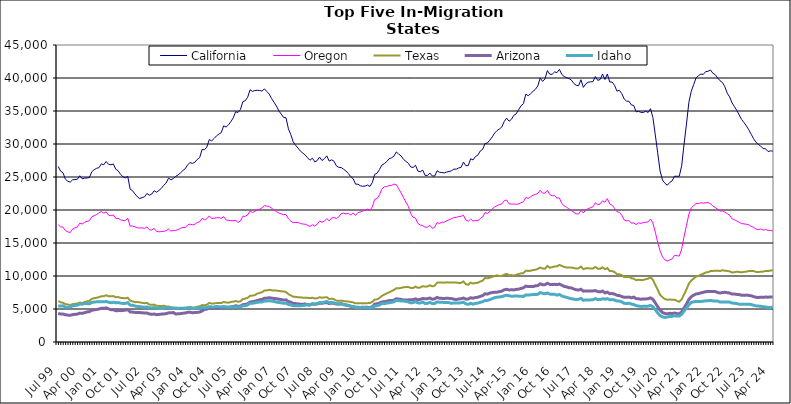
| Category |  California  |  Oregon  |  Texas  |  Arizona  |  Idaho  |
|---|---|---|---|---|---|
| Jul 99 | 26605 | 17749 | 6209 | 4339 | 5471 |
| Aug 99 | 25882 | 17447 | 6022 | 4228 | 5444 |
| Sep 99 | 25644 | 17401 | 5941 | 4237 | 5488 |
| Oct 99 | 24669 | 16875 | 5751 | 4134 | 5279 |
| Nov 99 | 24353 | 16701 | 5680 | 4073 | 5260 |
| Dec 99 | 24218 | 16570 | 5619 | 4042 | 5269 |
| Jan 00 | 24574 | 17109 | 5736 | 4142 | 5485 |
| Feb 00 | 24620 | 17295 | 5789 | 4192 | 5530 |
| Mar 00 | 24655 | 17436 | 5826 | 4226 | 5590 |
| Apr 00 | 25195 | 18009 | 5980 | 4375 | 5748 |
| May 00 | 24730 | 17875 | 5897 | 4337 | 5729 |
| Jun 00 | 24825 | 18113 | 6070 | 4444 | 5853 |
| Jul 00 | 24857 | 18294 | 6163 | 4555 | 5824 |
| Aug 00 | 24913 | 18376 | 6199 | 4603 | 5788 |
| Sep 00 | 25792 | 18971 | 6529 | 4804 | 5976 |
| Oct 00 | 26106 | 19135 | 6643 | 4870 | 6058 |
| Nov 00 | 26315 | 19306 | 6705 | 4926 | 6085 |
| Dec 00 | 26415 | 19570 | 6793 | 4991 | 6096 |
| Jan 01 | 26995 | 19781 | 6942 | 5122 | 6119 |
| Feb 01 | 26851 | 19519 | 6948 | 5089 | 6090 |
| Mar 01 | 27352 | 19720 | 7080 | 5180 | 6143 |
| Apr 01 | 26918 | 19221 | 6943 | 5020 | 6020 |
| May 01 | 26848 | 19126 | 6924 | 4899 | 5950 |
| Jun 01 | 26974 | 19241 | 6959 | 4895 | 6019 |
| Jul 01 | 26172 | 18725 | 6778 | 4737 | 5951 |
| Aug 01 | 25943 | 18736 | 6810 | 4757 | 5973 |
| Sep 01 | 25399 | 18514 | 6688 | 4753 | 5895 |
| Oct 01 | 25050 | 18415 | 6650 | 4780 | 5833 |
| Nov 01 | 24873 | 18381 | 6631 | 4826 | 5850 |
| Dec 01 | 25099 | 18765 | 6708 | 4898 | 5969 |
| Jan 02 | 23158 | 17561 | 6261 | 4560 | 5595 |
| Feb 02 | 22926 | 17573 | 6162 | 4531 | 5560 |
| Mar 02 | 22433 | 17452 | 6052 | 4481 | 5458 |
| Apr 02 | 22012 | 17314 | 6046 | 4458 | 5380 |
| May 02 | 21733 | 17267 | 6007 | 4452 | 5358 |
| Jun 02 | 21876 | 17298 | 5933 | 4444 | 5315 |
| Jul 02 | 21997 | 17209 | 5873 | 4383 | 5243 |
| Aug 02 | 22507 | 17436 | 5929 | 4407 | 5315 |
| Sep 02 | 22244 | 17010 | 5672 | 4248 | 5192 |
| Oct 02 | 22406 | 16952 | 5625 | 4191 | 5167 |
| Nov 02 | 22922 | 17223 | 5663 | 4242 | 5221 |
| Dec 02 | 22693 | 16770 | 5499 | 4142 | 5120 |
| Jan 03 | 22964 | 16694 | 5463 | 4166 | 5089 |
| Feb 03 | 23276 | 16727 | 5461 | 4226 | 5077 |
| Mar 03 | 23736 | 16766 | 5486 | 4251 | 5145 |
| Apr 03 | 24079 | 16859 | 5389 | 4289 | 5145 |
| May 03 | 24821 | 17117 | 5378 | 4415 | 5254 |
| Jun 03 | 24592 | 16812 | 5273 | 4426 | 5135 |
| Jul 03 | 24754 | 16875 | 5226 | 4466 | 5124 |
| Aug 03 | 25092 | 16922 | 5181 | 4244 | 5100 |
| Sep 03 | 25316 | 17036 | 5181 | 4279 | 5086 |
| Oct 03 | 25622 | 17228 | 5139 | 4301 | 5110 |
| Nov 03 | 25984 | 17335 | 5175 | 4362 | 5091 |
| Dec 03 | 26269 | 17350 | 5189 | 4396 | 5113 |
| Jan 04 | 26852 | 17734 | 5255 | 4492 | 5152 |
| Feb 04 | 27184 | 17860 | 5301 | 4502 | 5183 |
| Mar 04 | 27062 | 17757 | 5227 | 4443 | 5056 |
| Apr 04 | 27238 | 17840 | 5227 | 4461 | 5104 |
| May 04 | 27671 | 18113 | 5345 | 4493 | 5095 |
| Jun 04 | 27949 | 18201 | 5416 | 4532 | 5103 |
| Jul 04 | 29172 | 18727 | 5597 | 4697 | 5231 |
| Aug 04 | 29122 | 18529 | 5561 | 4945 | 5197 |
| Sep 04 | 29542 | 18678 | 5656 | 4976 | 5237 |
| Oct 04 | 30674 | 19108 | 5922 | 5188 | 5363 |
| Nov 04 | 30472 | 18716 | 5823 | 5106 | 5321 |
| Dec 04 | 30831 | 18755 | 5838 | 5135 | 5312 |
| Jan 05 | 31224 | 18823 | 5906 | 5155 | 5374 |
| Feb 05 | 31495 | 18842 | 5898 | 5168 | 5357 |
| Mar 05 | 31714 | 18738 | 5894 | 5212 | 5313 |
| Apr 05 | 32750 | 18998 | 6060 | 5340 | 5350 |
| May 05 | 32575 | 18504 | 5989 | 5269 | 5276 |
| Jun 05 | 32898 | 18414 | 5954 | 5252 | 5271 |
| Jul 05 | 33384 | 18395 | 6062 | 5322 | 5322 |
| Aug 05 | 33964 | 18381 | 6113 | 5375 | 5316 |
| Sep 05 | 34897 | 18426 | 6206 | 5493 | 5362 |
| Oct 05 | 34780 | 18132 | 6100 | 5408 | 5308 |
| Nov 05 | 35223 | 18332 | 6162 | 5434 | 5314 |
| Dec 05 | 36415 | 19047 | 6508 | 5658 | 5487 |
| Jan 06 | 36567 | 19032 | 6576 | 5688 | 5480 |
| Feb 06 | 37074 | 19257 | 6692 | 5792 | 5616 |
| Mar 06 | 38207 | 19845 | 6993 | 6052 | 5850 |
| Apr 06 | 37976 | 19637 | 7024 | 6101 | 5864 |
| May 06 | 38099 | 19781 | 7114 | 6178 | 5943 |
| Jun 06 | 38141 | 20061 | 7331 | 6276 | 6018 |
| Jul 06 | 38097 | 20111 | 7431 | 6399 | 6046 |
| Aug 06 | 38021 | 20333 | 7542 | 6450 | 6064 |
| Sep 06 | 38349 | 20686 | 7798 | 6627 | 6232 |
| Oct 06 | 37947 | 20591 | 7825 | 6647 | 6216 |
| Nov 06 | 37565 | 20526 | 7907 | 6707 | 6244 |
| Dec 06 | 36884 | 20272 | 7840 | 6648 | 6192 |
| Jan 07 | 36321 | 19984 | 7789 | 6597 | 6151 |
| Feb 07 | 35752 | 19752 | 7799 | 6554 | 6048 |
| Mar 07 | 35025 | 19547 | 7737 | 6487 | 5989 |
| Apr 07 | 34534 | 19412 | 7685 | 6430 | 5937 |
| May 07 | 34022 | 19296 | 7654 | 6353 | 5858 |
| Jun 07 | 33974 | 19318 | 7577 | 6390 | 5886 |
| Jul 07 | 32298 | 18677 | 7250 | 6117 | 5682 |
| Aug 07 | 31436 | 18322 | 7070 | 6034 | 5617 |
| Sep 07 | 30331 | 18087 | 6853 | 5847 | 5500 |
| Oct 07 | 29813 | 18108 | 6839 | 5821 | 5489 |
| Nov 07 | 29384 | 18105 | 6777 | 5769 | 5481 |
| Dec 07 | 28923 | 17949 | 6760 | 5733 | 5499 |
| Jan 08 | 28627 | 17890 | 6721 | 5732 | 5521 |
| Feb 08 | 28328 | 17834 | 6719 | 5749 | 5579 |
| Mar 08 | 27911 | 17680 | 6690 | 5650 | 5614 |
| Apr 08 | 27543 | 17512 | 6656 | 5612 | 5635 |
| May 08 | 27856 | 17754 | 6705 | 5774 | 5798 |
| Jun 08 | 27287 | 17589 | 6593 | 5717 | 5745 |
| Jul 08 | 27495 | 17834 | 6623 | 5761 | 5807 |
| Aug 08 | 28018 | 18309 | 6789 | 5867 | 5982 |
| Sep-08 | 27491 | 18164 | 6708 | 5864 | 5954 |
| Oct 08 | 27771 | 18291 | 6755 | 5942 | 6032 |
| Nov 08 | 28206 | 18706 | 6787 | 5970 | 6150 |
| Dec 08 | 27408 | 18353 | 6505 | 5832 | 5975 |
| Jan 09 | 27601 | 18778 | 6569 | 5890 | 5995 |
| Feb 09 | 27394 | 18863 | 6483 | 5845 | 5936 |
| Mar 09 | 26690 | 18694 | 6273 | 5751 | 5806 |
| Apr 09 | 26461 | 18943 | 6222 | 5735 | 5777 |
| May 09 | 26435 | 19470 | 6272 | 5819 | 5767 |
| Jun 09 | 26187 | 19522 | 6199 | 5700 | 5649 |
| Jul 09 | 25906 | 19408 | 6171 | 5603 | 5617 |
| Aug 09 | 25525 | 19469 | 6128 | 5533 | 5540 |
| Sep 09 | 25050 | 19249 | 6059 | 5405 | 5437 |
| Oct 09 | 24741 | 19529 | 6004 | 5349 | 5369 |
| Nov 09 | 23928 | 19187 | 5854 | 5271 | 5248 |
| Dec 09 | 23899 | 19607 | 5886 | 5261 | 5195 |
| Jan 10 | 23676 | 19703 | 5881 | 5232 | 5234 |
| Feb 10 | 23592 | 19845 | 5850 | 5272 | 5236 |
| Mar 10 | 23634 | 19946 | 5864 | 5278 | 5219 |
| Apr 10 | 23774 | 20134 | 5889 | 5257 | 5201 |
| May 10 | 23567 | 19966 | 5897 | 5172 | 5105 |
| Jun 10 | 24166 | 20464 | 6087 | 5356 | 5237 |
| Jul 10 | 25410 | 21627 | 6417 | 5742 | 5452 |
| Aug 10 | 25586 | 21744 | 6465 | 5797 | 5491 |
| Sep 10 | 26150 | 22314 | 6667 | 5907 | 5609 |
| Oct 10 | 26807 | 23219 | 6986 | 6070 | 5831 |
| Nov 10 | 27033 | 23520 | 7179 | 6100 | 5810 |
| Dec 10 | 27332 | 23551 | 7361 | 6182 | 5898 |
| Jan 11 | 27769 | 23697 | 7525 | 6276 | 5938 |
| Feb 11 | 27898 | 23718 | 7708 | 6267 | 6016 |
| Mar 11 | 28155 | 23921 | 7890 | 6330 | 6081 |
| Apr 11 | 28790 | 23847 | 8146 | 6544 | 6305 |
| May 11 | 28471 | 23215 | 8131 | 6502 | 6248 |
| Jun 11 | 28191 | 22580 | 8199 | 6445 | 6217 |
| Jul 11 | 27678 | 21867 | 8291 | 6368 | 6202 |
| Aug 11 | 27372 | 21203 | 8321 | 6356 | 6146 |
| Sep 11 | 27082 | 20570 | 8341 | 6387 | 6075 |
| Oct 11 | 26528 | 19442 | 8191 | 6402 | 5932 |
| Nov 11 | 26440 | 18872 | 8176 | 6426 | 5968 |
| Dec 11 | 26770 | 18784 | 8401 | 6533 | 6106 |
| Jan 12 | 25901 | 17963 | 8202 | 6390 | 5933 |
| Feb 12 | 25796 | 17718 | 8266 | 6456 | 5900 |
| Mar 12 | 26042 | 17647 | 8456 | 6600 | 6054 |
| Apr 12 | 25239 | 17386 | 8388 | 6534 | 5838 |
| May 12 | 25238 | 17407 | 8401 | 6558 | 5854 |
| Jun 12 | 25593 | 17673 | 8594 | 6669 | 6009 |
| Jul 12 | 25155 | 17237 | 8432 | 6474 | 5817 |
| Aug 12 | 25146 | 17391 | 8536 | 6539 | 5842 |
| Sep 12 | 25942 | 18102 | 8989 | 6759 | 6061 |
| Oct 12 | 25718 | 17953 | 9012 | 6618 | 6027 |
| Nov 12 | 25677 | 18134 | 9032 | 6611 | 6009 |
| Dec 12 | 25619 | 18166 | 8981 | 6601 | 5999 |
| Jan 13 | 25757 | 18344 | 9051 | 6627 | 5989 |
| Feb-13 | 25830 | 18512 | 9001 | 6606 | 5968 |
| Mar-13 | 25940 | 18689 | 9021 | 6577 | 5853 |
| Apr 13 | 26187 | 18844 | 9013 | 6478 | 5925 |
| May 13 | 26192 | 18884 | 9003 | 6431 | 5924 |
| Jun-13 | 26362 | 19013 | 8948 | 6508 | 5896 |
| Jul 13 | 26467 | 19037 | 8958 | 6559 | 5948 |
| Aug 13 | 27253 | 19198 | 9174 | 6655 | 6020 |
| Sep 13 | 26711 | 18501 | 8747 | 6489 | 5775 |
| Oct 13 | 26733 | 18301 | 8681 | 6511 | 5711 |
| Nov 13 | 27767 | 18620 | 8989 | 6709 | 5860 |
| Dec 13 | 27583 | 18320 | 8863 | 6637 | 5740 |
| Jan 14 | 28107 | 18409 | 8939 | 6735 | 5843 |
| Feb-14 | 28313 | 18383 | 8989 | 6779 | 5893 |
| Mar 14 | 28934 | 18696 | 9160 | 6918 | 6015 |
| Apr 14 | 29192 | 18946 | 9291 | 7036 | 6099 |
| May 14 | 30069 | 19603 | 9701 | 7314 | 6304 |
| Jun 14 | 30163 | 19487 | 9641 | 7252 | 6293 |
| Jul-14 | 30587 | 19754 | 9752 | 7415 | 6427 |
| Aug-14 | 31074 | 20201 | 9882 | 7499 | 6557 |
| Sep 14 | 31656 | 20459 | 9997 | 7536 | 6719 |
| Oct 14 | 32037 | 20663 | 10109 | 7555 | 6786 |
| Nov 14 | 32278 | 20825 | 9992 | 7628 | 6831 |
| Dec 14 | 32578 | 20918 | 10006 | 7705 | 6860 |
| Jan 15 | 33414 | 21396 | 10213 | 7906 | 7000 |
| Feb 15 | 33922 | 21518 | 10337 | 7982 | 7083 |
| Mar 15 | 33447 | 20942 | 10122 | 7891 | 7006 |
| Apr-15 | 33731 | 20893 | 10138 | 7906 | 6931 |
| May 15 | 34343 | 20902 | 10053 | 7895 | 6952 |
| Jun-15 | 34572 | 20870 | 10192 | 7973 | 6966 |
| Jul 15 | 35185 | 20916 | 10303 | 8000 | 6949 |
| Aug 15 | 35780 | 21115 | 10399 | 8126 | 6938 |
| Sep 15 | 36109 | 21246 | 10428 | 8207 | 6896 |
| Oct 15 | 37555 | 21908 | 10813 | 8477 | 7140 |
| Nov 15 | 37319 | 21750 | 10763 | 8390 | 7112 |
| Dec 15 | 37624 | 21990 | 10807 | 8395 | 7149 |
| Jan 16 | 37978 | 22248 | 10892 | 8388 | 7201 |
| Feb 16 | 38285 | 22369 | 10951 | 8508 | 7192 |
| Mar 16 | 38792 | 22506 | 11075 | 8547 | 7226 |
| Apr 16 | 39994 | 22999 | 11286 | 8815 | 7487 |
| May 16 | 39488 | 22548 | 11132 | 8673 | 7382 |
| Jun 16 | 39864 | 22556 | 11100 | 8682 | 7315 |
| Jul 16 | 41123 | 22989 | 11516 | 8903 | 7420 |
| Aug 16 | 40573 | 22333 | 11251 | 8731 | 7261 |
| Sep 16 | 40560 | 22162 | 11340 | 8692 | 7216 |
| Oct 16 | 40923 | 22172 | 11456 | 8742 | 7233 |
| Nov 16 | 40817 | 21818 | 11459 | 8685 | 7101 |
| Dec 16 | 41311 | 21815 | 11681 | 8783 | 7203 |
| Jan 17 | 40543 | 21029 | 11524 | 8609 | 6982 |
| Feb 17 | 40218 | 20613 | 11385 | 8416 | 6852 |
| Mar 17 | 40052 | 20425 | 11276 | 8354 | 6775 |
| Apr 17 | 39913 | 20147 | 11297 | 8218 | 6653 |
| May 17 | 39695 | 19910 | 11265 | 8196 | 6552 |
| Jun 17 | 39177 | 19650 | 11225 | 8034 | 6500 |
| Jul 17 | 38901 | 19419 | 11115 | 7923 | 6429 |
| Aug 17 | 38827 | 19389 | 11168 | 7867 | 6479 |
| Sep 17 | 39736 | 19936 | 11426 | 7991 | 6609 |
| Oct 17 | 38576 | 19547 | 11041 | 7708 | 6315 |
| Nov 17 | 39108 | 20013 | 11158 | 7746 | 6381 |
| Dec 17 | 39359 | 20202 | 11185 | 7743 | 6366 |
| Jan 18 | 39420 | 20362 | 11118 | 7736 | 6380 |
| Feb 18 | 39440 | 20476 | 11128 | 7741 | 6407 |
| Mar 18 | 40218 | 21106 | 11362 | 7789 | 6578 |
| Apr 18 | 39637 | 20788 | 11111 | 7642 | 6423 |
| May 18 | 39777 | 20933 | 11097 | 7591 | 6430 |
| Jun 18 | 40602 | 21381 | 11317 | 7721 | 6554 |
| Jul 18 | 39767 | 21189 | 11038 | 7445 | 6489 |
| Aug 18 | 40608 | 21729 | 11200 | 7560 | 6569 |
| Sep 18 | 39395 | 20916 | 10772 | 7318 | 6383 |
| Oct 18 | 39383 | 20724 | 10740 | 7344 | 6429 |
| Nov 18 | 38891 | 20265 | 10605 | 7255 | 6365 |
| Dec 18 | 38013 | 19741 | 10292 | 7069 | 6205 |
| Jan 19 | 38130 | 19643 | 10261 | 7032 | 6203 |
| Feb 19 | 37658 | 19237 | 10132 | 6892 | 6073 |
| Mar 19 | 36831 | 18492 | 9848 | 6766 | 5863 |
| Apr 19 | 36492 | 18349 | 9839 | 6763 | 5827 |
| May 19 | 36481 | 18407 | 9867 | 6809 | 5873 |
| Jun 19 | 35925 | 17998 | 9661 | 6698 | 5761 |
| Jul 19 | 35843 | 18049 | 9598 | 6800 | 5673 |
| Aug 19 | 34870 | 17785 | 9361 | 6577 | 5512 |
| Sep 19 | 34945 | 18038 | 9428 | 6547 | 5437 |
| Oct 19 | 34802 | 17977 | 9385 | 6483 | 5390 |
| Nov 19 | 34775 | 18072 | 9403 | 6511 | 5401 |
| Dec 19 | 34976 | 18140 | 9518 | 6521 | 5419 |
| Jan 20 | 34774 | 18209 | 9594 | 6561 | 5434 |
| Feb 20 | 35352 | 18632 | 9804 | 6682 | 5543 |
| Mar 20 | 34013 | 18041 | 9411 | 6464 | 5330 |
| Apr 20 | 31385 | 16629 | 8666 | 5922 | 4906 |
| May 20 | 28657 | 15123 | 7927 | 5355 | 4419 |
| Jun 20 | 25915 | 13817 | 7164 | 4815 | 3992 |
| Jul 20 | 24545 | 12926 | 6776 | 4457 | 3810 |
| Aug 20 | 24048 | 12443 | 6521 | 4326 | 3720 |
| Sep 20 | 23756 | 12258 | 6386 | 4266 | 3784 |
| Oct 20 | 24166 | 12429 | 6452 | 4347 | 3861 |
| Nov 20 | 24404 | 12597 | 6386 | 4324 | 3883 |
| Dec 20 | 25120 | 13122 | 6420 | 4394 | 3974 |
| Jan 21 | 25111 | 13080 | 6236 | 4304 | 3924 |
| Feb 21 | 25114 | 13015 | 6094 | 4260 | 3930 |
| Mar 21 | 26701 | 14096 | 6455 | 4567 | 4185 |
| Apr 21 | 29998 | 15978 | 7222 | 5164 | 4697 |
| May 21 | 33020 | 17641 | 7969 | 5748 | 5148 |
| Jun 21 | 36320 | 19369 | 8840 | 6450 | 5628 |
| Jul 21 | 37989 | 20320 | 9306 | 6877 | 5984 |
| Aug 21 | 39007 | 20657 | 9615 | 7094 | 6084 |
| Sep 21 | 40023 | 20974 | 9914 | 7277 | 6151 |
| Oct 21 | 40348 | 20966 | 10003 | 7327 | 6140 |
| Nov 21 | 40599 | 21096 | 10203 | 7437 | 6136 |
| Dec 21 | 40548 | 21032 | 10328 | 7532 | 6183 |
| Jan 22 | 40967 | 21106 | 10535 | 7618 | 6237 |
| Feb 22 | 41019 | 21125 | 10579 | 7673 | 6236 |
| Mar 22 | 41220 | 20949 | 10751 | 7660 | 6310 |
| Apr 22 | 40730 | 20602 | 10772 | 7661 | 6221 |
| May 22 | 40504 | 20370 | 10792 | 7636 | 6210 |
| Jun 22 | 40013 | 20127 | 10802 | 7504 | 6199 |
| Jul 22 | 39582 | 19846 | 10761 | 7419 | 6050 |
| Aug 22 | 39321 | 19865 | 10868 | 7487 | 6071 |
| Sep 22 | 38685 | 19666 | 10811 | 7536 | 6074 |
| Oct 22 | 37700 | 19450 | 10764 | 7469 | 6042 |
| Nov 22 | 37133 | 19198 | 10701 | 7425 | 6042 |
| Dec 22 | 36232 | 18659 | 10527 | 7261 | 5898 |
| Jan 23 | 35674 | 18528 | 10578 | 7263 | 5879 |
| Feb 23 | 35072 | 18344 | 10642 | 7211 | 5827 |
| Mar 23 | 34396 | 18133 | 10609 | 7183 | 5713 |
| Apr 23 | 33708 | 17931 | 10559 | 7074 | 5706 |
| May 23 | 33245 | 17904 | 10624 | 7091 | 5712 |
| Jun 23 | 32727 | 17831 | 10663 | 7105 | 5726 |
| Jul 23 | 32148 | 17773 | 10760 | 7058 | 5719 |
| Aug 23 | 31461 | 17513 | 10759 | 6999 | 5681 |
| Sep 23 | 30794 | 17376 | 10754 | 6882 | 5566 |
| Oct 23 | 30268 | 17096 | 10620 | 6775 | 5477 |
| Nov 23 | 29929 | 17029 | 10602 | 6746 | 5443 |
| Dec 23 | 29649 | 17114 | 10651 | 6787 | 5409 |
| Jan 24 | 29317 | 16951 | 10667 | 6765 | 5333 |
| Feb 24 | 29270 | 17045 | 10763 | 6813 | 5315 |
| Mar 24 | 28860 | 16919 | 10744 | 6786 | 5229 |
| Apr 24 | 28960 | 16905 | 10825 | 6832 | 5239 |
| May 24 | 28927 | 16828 | 10880 | 6825 | 5254 |